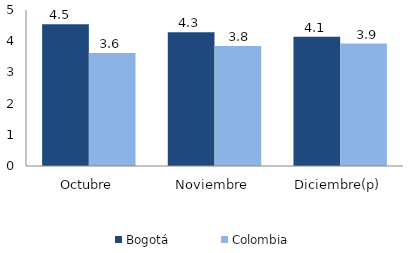
| Category | Bogotá | Colombia |
|---|---|---|
| Octubre | 4.545 | 3.621 |
| Noviembre | 4.287 | 3.849 |
| Diciembre(p) | 4.143 | 3.925 |